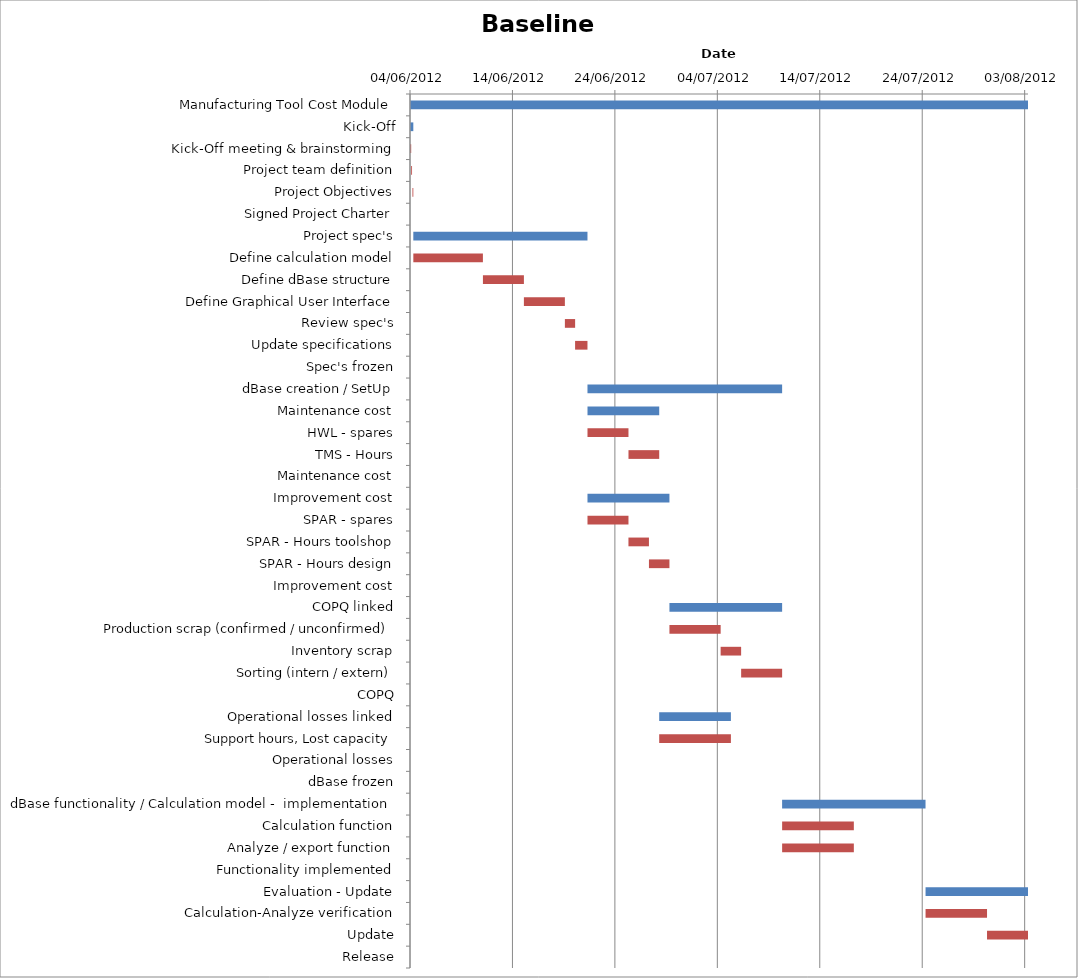
| Category | Baseline start | Actual duration |
|---|---|---|
| Manufacturing Tool Cost Module | 41064.333 | 60.292 |
| Kick-Off | 41064.333 | 0.292 |
| Kick-Off meeting & brainstorming | 41064.333 | 0.083 |
| Project team definition | 41064.417 | 0.083 |
| Project Objectives | 41064.542 | 0.083 |
| Signed Project Charter | 41064.625 | 0 |
| Project spec's | 41064.625 | 17 |
| Define calculation model | 41064.625 | 6.792 |
| Define dBase structure | 41071.417 | 4 |
| Define Graphical User Interface | 41075.417 | 4 |
| Review spec's | 41079.417 | 1 |
| Update specifications | 41080.417 | 1.208 |
| Spec's frozen | 41081.625 | 0 |
| dBase creation / SetUp | 41081.625 | 19 |
| Maintenance cost | 41081.625 | 7 |
| HWL - spares | 41081.625 | 4 |
| TMS - Hours | 41085.625 | 3 |
| Maintenance cost | 41088.625 | 0 |
| Improvement cost | 41081.625 | 8 |
| SPAR - spares | 41081.625 | 4 |
| SPAR - Hours toolshop | 41085.625 | 2 |
| SPAR - Hours design | 41087.625 | 2 |
| Improvement cost | 41089.625 | 0 |
| COPQ linked | 41089.625 | 11 |
| Production scrap (confirmed / unconfirmed) | 41089.625 | 5 |
| Inventory scrap | 41094.625 | 2 |
| Sorting (intern / extern) | 41096.625 | 4 |
| COPQ | 41100.625 | 0 |
| Operational losses linked | 41088.625 | 7 |
| Support hours, Lost capacity | 41088.625 | 7 |
| Operational losses | 41095.625 | 0 |
| dBase frozen | 41100.625 | 0 |
| dBase functionality / Calculation model -  implementation | 41100.625 | 14 |
| Calculation function | 41100.625 | 7 |
| Analyze / export function | 41100.625 | 7 |
| Functionality implemented | 41114.625 | 0 |
| Evaluation - Update | 41114.625 | 10 |
| Calculation-Analyze verification | 41114.625 | 6 |
| Update | 41120.625 | 4 |
| Release | 41124.625 | 0 |